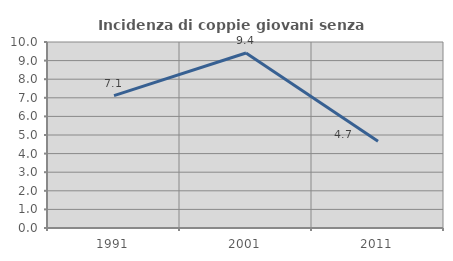
| Category | Incidenza di coppie giovani senza figli |
|---|---|
| 1991.0 | 7.119 |
| 2001.0 | 9.409 |
| 2011.0 | 4.668 |